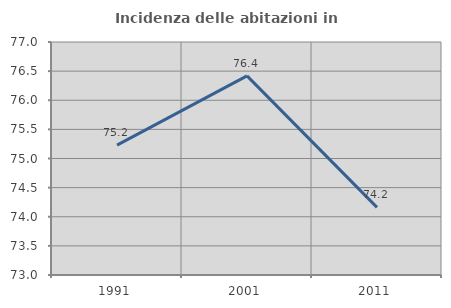
| Category | Incidenza delle abitazioni in proprietà  |
|---|---|
| 1991.0 | 75.229 |
| 2001.0 | 76.418 |
| 2011.0 | 74.161 |